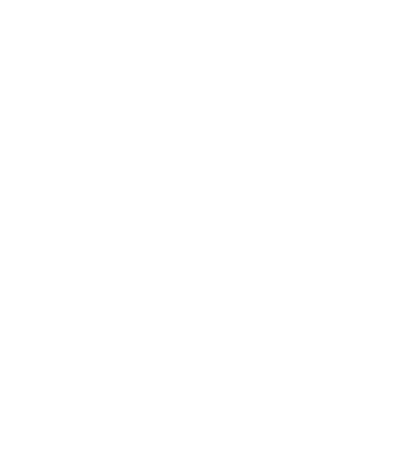
| Category | Total |
|---|---|
| Other 2 | 0 |
| Other 1 | 0 |
| Club/Memberships | 300 |
| Personal Care | 300 |
| Gifts | 600 |
| Charity | 600 |
| Entertainment | 1200 |
| Dining | 1200 |
| Shopping | 2000 |
| Travel | 2250 |
| Home Improvements | 4800 |